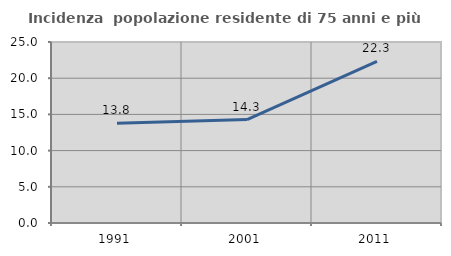
| Category | Incidenza  popolazione residente di 75 anni e più |
|---|---|
| 1991.0 | 13.793 |
| 2001.0 | 14.286 |
| 2011.0 | 22.333 |